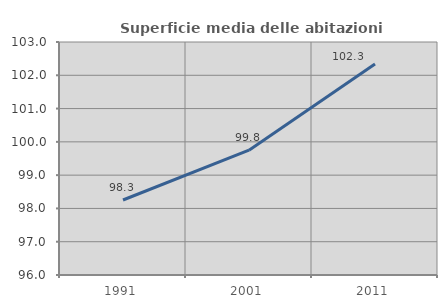
| Category | Superficie media delle abitazioni occupate |
|---|---|
| 1991.0 | 98.253 |
| 2001.0 | 99.751 |
| 2011.0 | 102.336 |